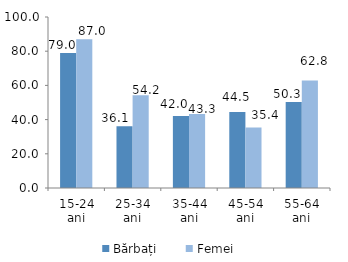
| Category | Bărbați | Femei |
|---|---|---|
| 15-24 ani | 78.972 | 87.014 |
| 25-34 ani | 36.078 | 54.194 |
| 35-44 ani | 42.043 | 43.291 |
| 45-54 ani | 44.495 | 35.422 |
| 55-64 ani | 50.341 | 62.813 |